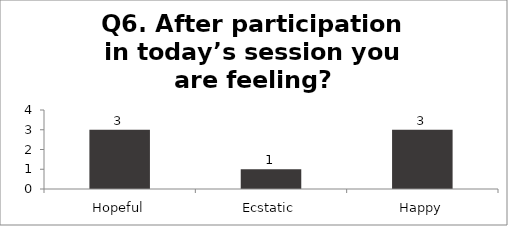
| Category | Q6. After participation in today’s session you are feeling? |
|---|---|
| Hopeful | 3 |
| Ecstatic | 1 |
| Happy | 3 |